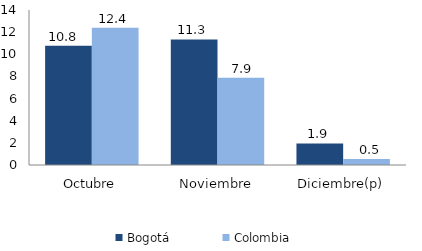
| Category | Bogotá | Colombia |
|---|---|---|
| Octubre | 10.78 | 12.405 |
| Noviembre | 11.336 | 7.876 |
| Diciembre(p) | 1.947 | 0.533 |